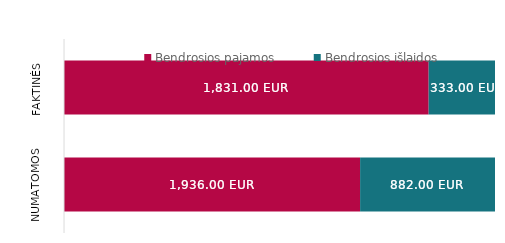
| Category | Bendrosios pajamos | Bendrosios išlaidos |
|---|---|---|
| Numatomos | 1936 | 882 |
| Faktinės | 1831 | 333 |